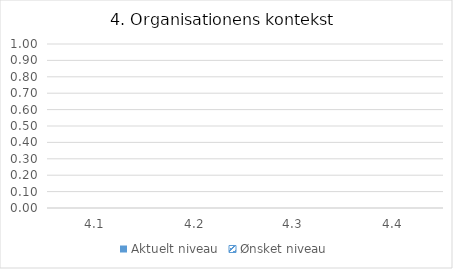
| Category | Aktuelt niveau | Ønsket niveau |
|---|---|---|
| 4.1 | 0 | 0 |
| 4.2 | 0 | 0 |
| 4.3 | 0 | 0 |
| 4.4 | 0 | 0 |